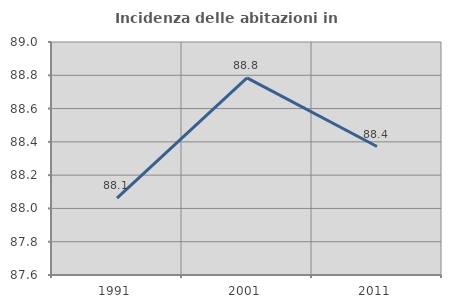
| Category | Incidenza delle abitazioni in proprietà  |
|---|---|
| 1991.0 | 88.062 |
| 2001.0 | 88.784 |
| 2011.0 | 88.372 |